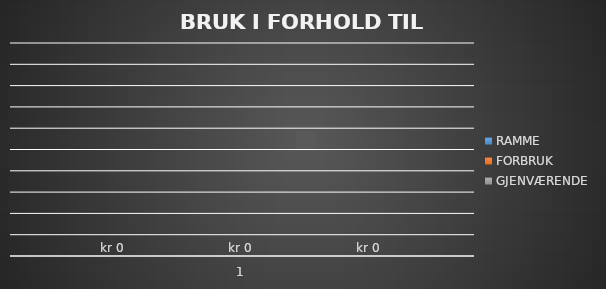
| Category | RAMME | FORBRUK | GJENVÆRENDE |
|---|---|---|---|
| 0 | 0 | 0 | 0 |